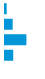
| Category | Series 0 |
|---|---|
| 0 | 0.043 |
| 1 | 0.197 |
| 2 | 0.549 |
| 3 | 0.211 |